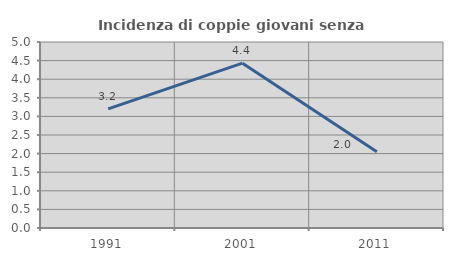
| Category | Incidenza di coppie giovani senza figli |
|---|---|
| 1991.0 | 3.203 |
| 2001.0 | 4.43 |
| 2011.0 | 2.047 |